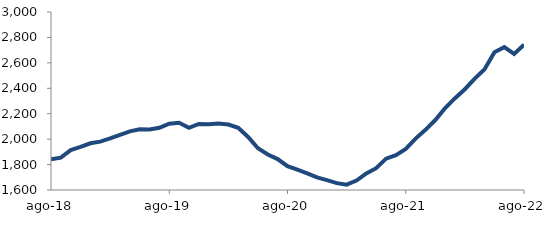
| Category | Series 0 |
|---|---|
| 2018-08-01 | 1840.869 |
| 2018-09-01 | 1854.761 |
| 2018-10-01 | 1913.466 |
| 2018-11-01 | 1938.846 |
| 2018-12-01 | 1967.481 |
| 2019-01-01 | 1980.122 |
| 2019-02-01 | 2005.664 |
| 2019-03-01 | 2033.637 |
| 2019-04-01 | 2060.76 |
| 2019-05-01 | 2078.07 |
| 2019-06-01 | 2076.377 |
| 2019-07-01 | 2089.152 |
| 2019-08-01 | 2121.901 |
| 2019-09-01 | 2128.491 |
| 2019-10-01 | 2088.553 |
| 2019-11-01 | 2119.211 |
| 2019-12-01 | 2116.27 |
| 2020-01-01 | 2123.179 |
| 2020-02-01 | 2115.217 |
| 2020-03-01 | 2088.6 |
| 2020-04-01 | 2017.241 |
| 2020-05-01 | 1928.116 |
| 2020-06-01 | 1878.979 |
| 2020-07-01 | 1843.29 |
| 2020-08-01 | 1787.543 |
| 2020-09-01 | 1760.281 |
| 2020-10-01 | 1731.197 |
| 2020-11-01 | 1698.835 |
| 2020-12-01 | 1677.184 |
| 2021-01-01 | 1654.072 |
| 2021-02-01 | 1641.869 |
| 2021-03-01 | 1673.821 |
| 2021-04-01 | 1730.759 |
| 2021-05-01 | 1771.425 |
| 2021-06-01 | 1846.573 |
| 2021-07-01 | 1874.111 |
| 2021-08-01 | 1922.894 |
| 2021-09-01 | 2004.225 |
| 2021-10-01 | 2073.331 |
| 2021-11-01 | 2150.314 |
| 2021-12-01 | 2244.492 |
| 2022-01-01 | 2321.95 |
| 2022-02-01 | 2392.65 |
| 2022-03-01 | 2476.383 |
| 2022-04-01 | 2549.069 |
| 2022-05-01 | 2683.336 |
| 2022-06-01 | 2723.868 |
| 2022-07-01 | 2670.585 |
| 2022-08-01 | 2742.913 |